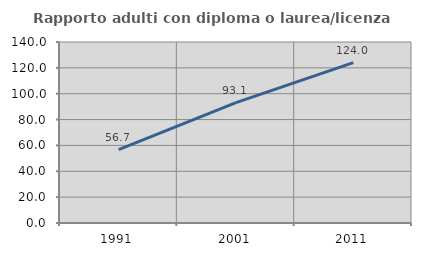
| Category | Rapporto adulti con diploma o laurea/licenza media  |
|---|---|
| 1991.0 | 56.688 |
| 2001.0 | 93.051 |
| 2011.0 | 124.031 |